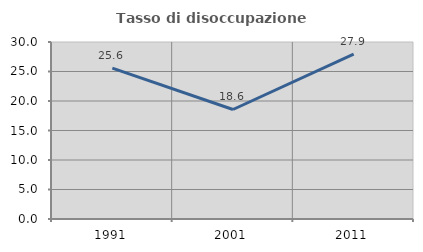
| Category | Tasso di disoccupazione giovanile  |
|---|---|
| 1991.0 | 25.562 |
| 2001.0 | 18.561 |
| 2011.0 | 27.928 |